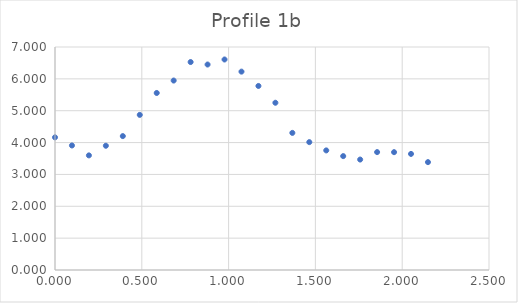
| Category | Series 0 |
|---|---|
| 0.0 | 4.164 |
| 0.09765625 | 3.909 |
| 0.1953125 | 3.598 |
| 0.29296875 | 3.9 |
| 0.390625 | 4.203 |
| 0.48828125 | 4.869 |
| 0.5859375 | 5.557 |
| 0.68359375 | 5.947 |
| 0.78125 | 6.528 |
| 0.87890625 | 6.45 |
| 0.9765625 | 6.608 |
| 1.07421875 | 6.227 |
| 1.171875 | 5.777 |
| 1.26953125 | 5.25 |
| 1.3671875 | 4.304 |
| 1.46484375 | 4.014 |
| 1.5625 | 3.754 |
| 1.66015625 | 3.575 |
| 1.7578125 | 3.467 |
| 1.85546875 | 3.701 |
| 1.953125 | 3.699 |
| 2.05078125 | 3.644 |
| 2.1484375 | 3.386 |